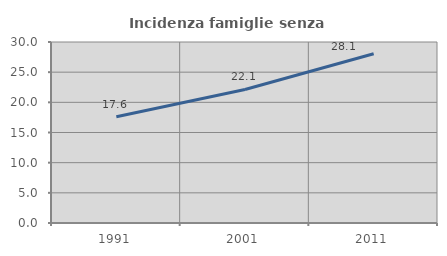
| Category | Incidenza famiglie senza nuclei |
|---|---|
| 1991.0 | 17.614 |
| 2001.0 | 22.129 |
| 2011.0 | 28.053 |